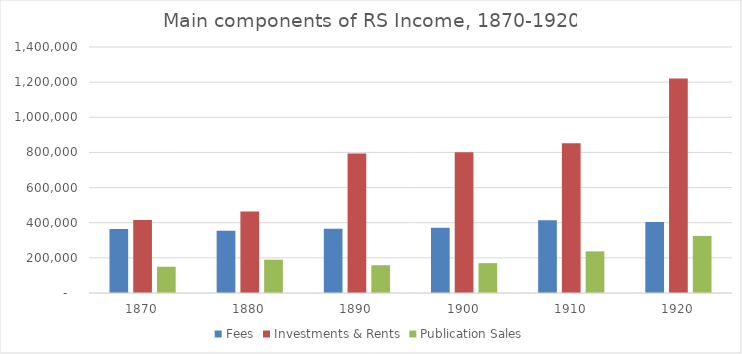
| Category | Fees | Investments & Rents | Publication Sales |
|---|---|---|---|
| 1870.0 | 363888 | 415600 | 149508 |
| 1880.0 | 354000 | 464251 | 189498 |
| 1890.0 | 366240 | 794435 | 158202 |
| 1900.0 | 372000 | 801548 | 169992 |
| 1910.0 | 414539 | 851756 | 236976 |
| 1920.0 | 404054 | 1221299 | 324264 |